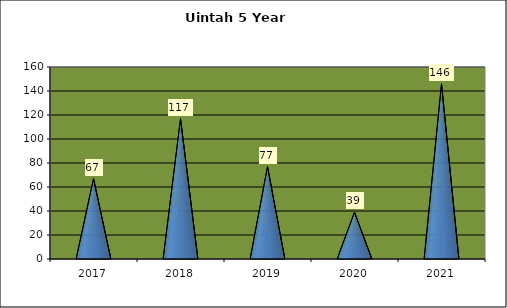
| Category | Washington Terrace April Comparison |
|---|---|
| 0 | 67 |
| 1 | 117 |
| 2 | 77 |
| 3 | 39 |
| 4 | 146 |